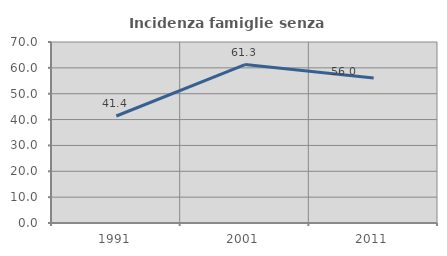
| Category | Incidenza famiglie senza nuclei |
|---|---|
| 1991.0 | 41.379 |
| 2001.0 | 61.29 |
| 2011.0 | 56.034 |